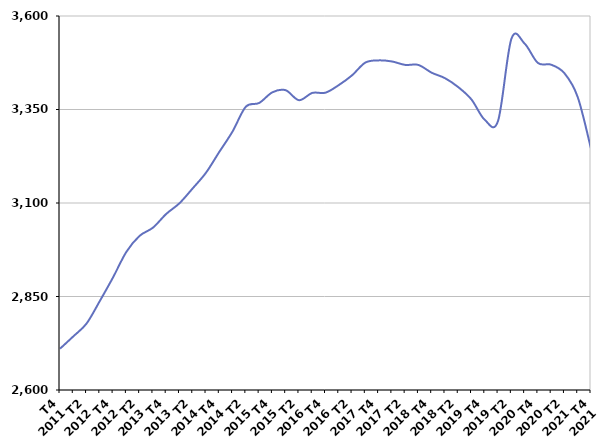
| Category | De 25 à 49 ans |
|---|---|
| T4
2011 | 2710.4 |
| T1
2012 | 2743.3 |
| T2
2012 | 2777.7 |
| T3
2012 | 2838 |
| T4
2012 | 2901.4 |
| T1
2013 | 2969.4 |
| T2
2013 | 3012.3 |
| T3
2013 | 3034 |
| T4
2013 | 3070.7 |
| T1
2014 | 3099.4 |
| T2
2014 | 3139.3 |
| T3
2014 | 3181.1 |
| T4
2014 | 3236.7 |
| T1
2015 | 3291.3 |
| T2
2015 | 3357.5 |
| T3
2015 | 3367.4 |
| T4
2015 | 3396 |
| T1
2016 | 3401.6 |
| T2
2016 | 3374.9 |
| T3
2016 | 3394.3 |
| T4
2016 | 3395 |
| T1
2017 | 3415.3 |
| T2
2017 | 3441.4 |
| T3
2017 | 3475.4 |
| T4
2017 | 3481.3 |
| T1
2018 | 3478.5 |
| T2
2018 | 3469.3 |
| T3
2018 | 3469.1 |
| T4
2018 | 3448.3 |
| T1
2019 | 3433.8 |
| T2
2019 | 3409.8 |
| T3
2019 | 3376.6 |
| T4
2019 | 3322.3 |
| T1
2020 | 3319.8 |
| T2
2020 | 3538.6 |
| T3
2020 | 3526.2 |
| T4
2020 | 3474.4 |
| T1
2021 | 3469.8 |
| T2
2021 | 3446.9 |
| T3
2021 | 3383.1 |
| T4
2021 | 3245.5 |